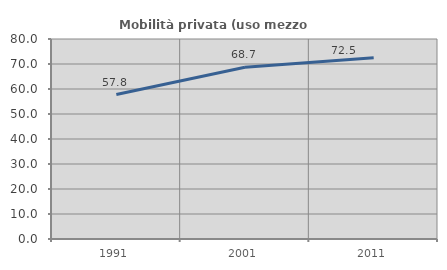
| Category | Mobilità privata (uso mezzo privato) |
|---|---|
| 1991.0 | 57.792 |
| 2001.0 | 68.685 |
| 2011.0 | 72.457 |